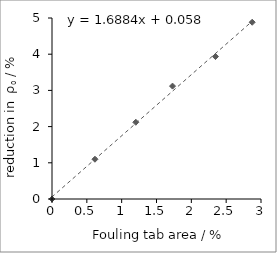
| Category | Series 0 |
|---|---|
| 0.0 | 0 |
| 0.6167266379343703 | 1.099 |
| 1.2026169439720222 | 2.12 |
| 1.7299182194059088 | 3.119 |
| 2.346644857340279 | 3.935 |
| 2.8739461327741656 | 4.883 |